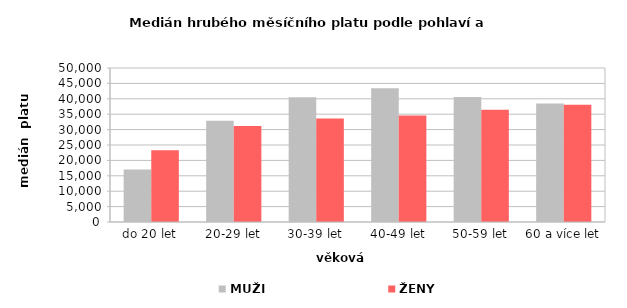
| Category | MUŽI | ŽENY |
|---|---|---|
| 0 | 17007.1 | 23320.906 |
| 1 | 32857.071 | 31200.765 |
| 2 | 40497.044 | 33564.498 |
| 3 | 43459.289 | 34586.551 |
| 4 | 40579.699 | 36444.169 |
| 5 | 38437.655 | 38067.211 |